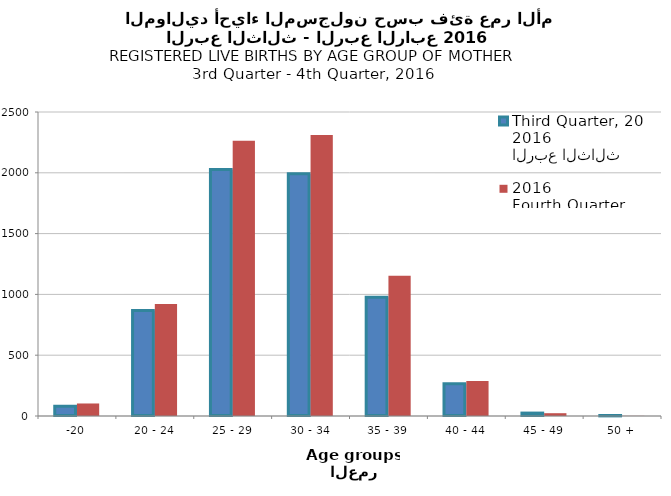
| Category | الربع الثالث 2016
Third Quarter, 2016 | الربع الرابع 2016
Fourth Quarter, 2016 |
|---|---|---|
| -20 | 81 | 103 |
| 20 - 24 | 868 | 922 |
| 25 - 29 | 2028 | 2264 |
| 30 - 34 | 1993 | 2311 |
| 35 - 39 | 977 | 1153 |
| 40 - 44 | 265 | 288 |
| 45 - 49 | 24 | 23 |
| 50 + | 1 | 1 |